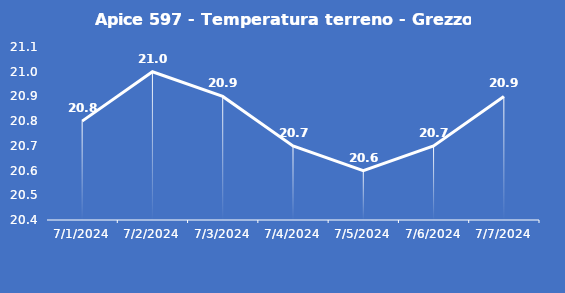
| Category | Apice 597 - Temperatura terreno - Grezzo (°C) |
|---|---|
| 7/1/24 | 20.8 |
| 7/2/24 | 21 |
| 7/3/24 | 20.9 |
| 7/4/24 | 20.7 |
| 7/5/24 | 20.6 |
| 7/6/24 | 20.7 |
| 7/7/24 | 20.9 |